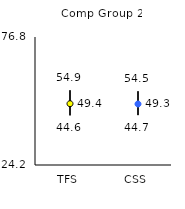
| Category | 25th | 75th | Mean |
|---|---|---|---|
| TFS | 44.6 | 54.9 | 49.39 |
| CSS | 44.7 | 54.5 | 49.27 |